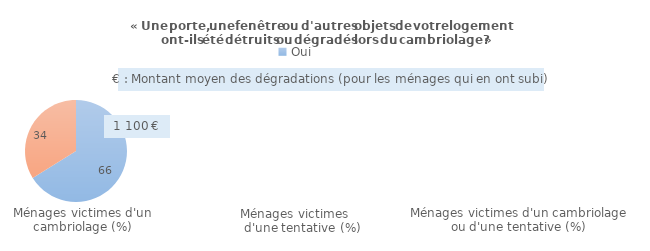
| Category | Cambriolages |
|---|---|
| Oui | 66.14 |
| Non | 33.86 |
| Ne sait pas/refus | 0 |